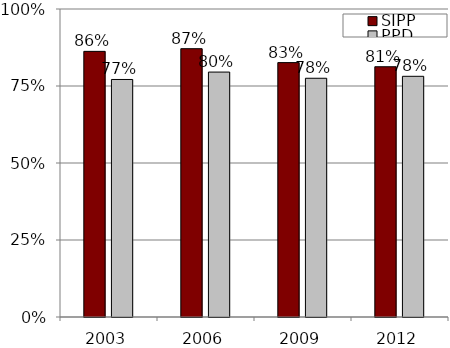
| Category | SIPP | PPD |
|---|---|---|
| 2003.0 | 0.862 | 0.771 |
| 2006.0 | 0.871 | 0.795 |
| 2009.0 | 0.826 | 0.775 |
| 2012.0 | 0.813 | 0.781 |